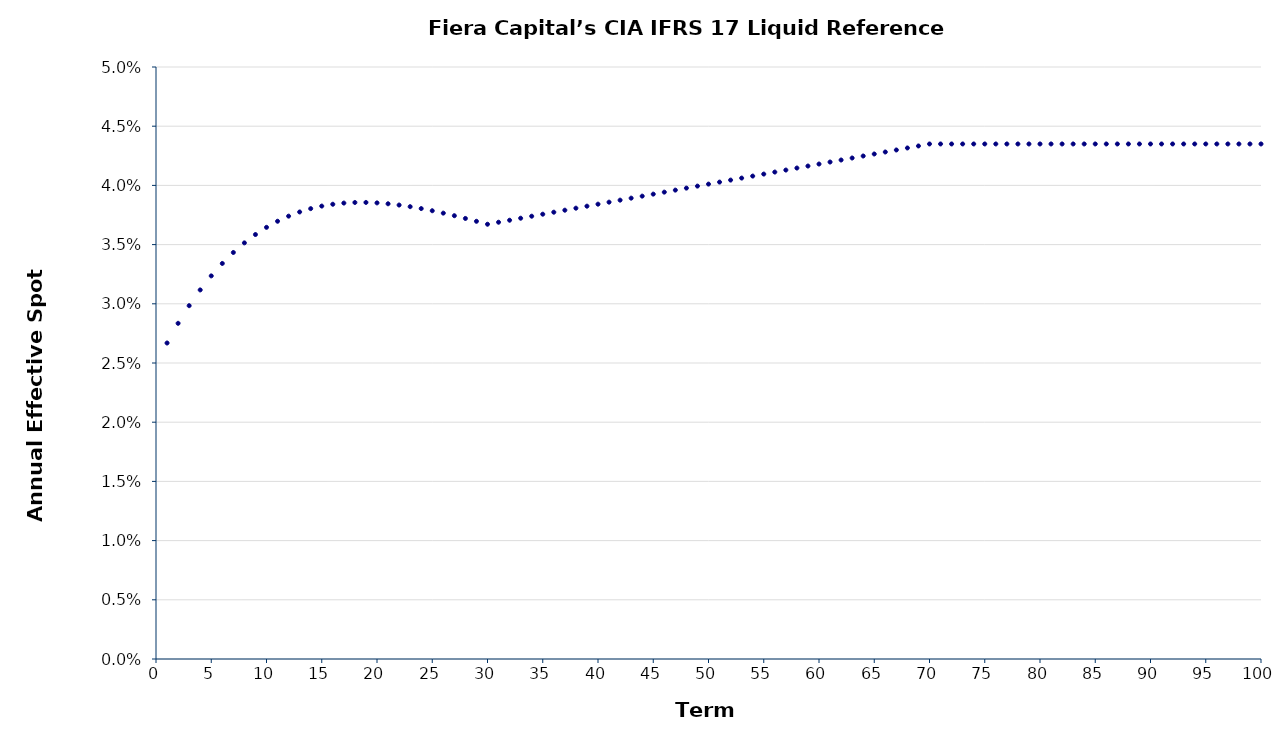
| Category | Annual Effective Spot Rate |
|---|---|
| 1.0 | 0.027 |
| 2.0 | 0.028 |
| 3.0 | 0.03 |
| 4.0 | 0.031 |
| 5.0 | 0.032 |
| 6.0 | 0.033 |
| 7.0 | 0.034 |
| 8.0 | 0.035 |
| 9.0 | 0.036 |
| 10.0 | 0.036 |
| 11.0 | 0.037 |
| 12.0 | 0.037 |
| 13.0 | 0.038 |
| 14.0 | 0.038 |
| 15.0 | 0.038 |
| 16.0 | 0.038 |
| 17.0 | 0.039 |
| 18.0 | 0.039 |
| 19.0 | 0.039 |
| 20.0 | 0.039 |
| 21.0 | 0.038 |
| 22.0 | 0.038 |
| 23.0 | 0.038 |
| 24.0 | 0.038 |
| 25.0 | 0.038 |
| 26.0 | 0.038 |
| 27.0 | 0.037 |
| 28.0 | 0.037 |
| 29.0 | 0.037 |
| 30.0 | 0.037 |
| 31.0 | 0.037 |
| 32.0 | 0.037 |
| 33.0 | 0.037 |
| 34.0 | 0.037 |
| 35.0 | 0.038 |
| 36.0 | 0.038 |
| 37.0 | 0.038 |
| 38.0 | 0.038 |
| 39.0 | 0.038 |
| 40.0 | 0.038 |
| 41.0 | 0.039 |
| 42.0 | 0.039 |
| 43.0 | 0.039 |
| 44.0 | 0.039 |
| 45.0 | 0.039 |
| 46.0 | 0.039 |
| 47.0 | 0.04 |
| 48.0 | 0.04 |
| 49.0 | 0.04 |
| 50.0 | 0.04 |
| 51.0 | 0.04 |
| 52.0 | 0.04 |
| 53.0 | 0.041 |
| 54.0 | 0.041 |
| 55.0 | 0.041 |
| 56.0 | 0.041 |
| 57.0 | 0.041 |
| 58.0 | 0.041 |
| 59.0 | 0.042 |
| 60.0 | 0.042 |
| 61.0 | 0.042 |
| 62.0 | 0.042 |
| 63.0 | 0.042 |
| 64.0 | 0.042 |
| 65.0 | 0.043 |
| 66.0 | 0.043 |
| 67.0 | 0.043 |
| 68.0 | 0.043 |
| 69.0 | 0.043 |
| 70.0 | 0.044 |
| 71.0 | 0.044 |
| 72.0 | 0.044 |
| 73.0 | 0.044 |
| 74.0 | 0.044 |
| 75.0 | 0.044 |
| 76.0 | 0.044 |
| 77.0 | 0.044 |
| 78.0 | 0.044 |
| 79.0 | 0.044 |
| 80.0 | 0.044 |
| 81.0 | 0.044 |
| 82.0 | 0.044 |
| 83.0 | 0.044 |
| 84.0 | 0.044 |
| 85.0 | 0.044 |
| 86.0 | 0.044 |
| 87.0 | 0.044 |
| 88.0 | 0.044 |
| 89.0 | 0.044 |
| 90.0 | 0.044 |
| 91.0 | 0.044 |
| 92.0 | 0.044 |
| 93.0 | 0.044 |
| 94.0 | 0.044 |
| 95.0 | 0.044 |
| 96.0 | 0.044 |
| 97.0 | 0.044 |
| 98.0 | 0.044 |
| 99.0 | 0.044 |
| 100.0 | 0.044 |